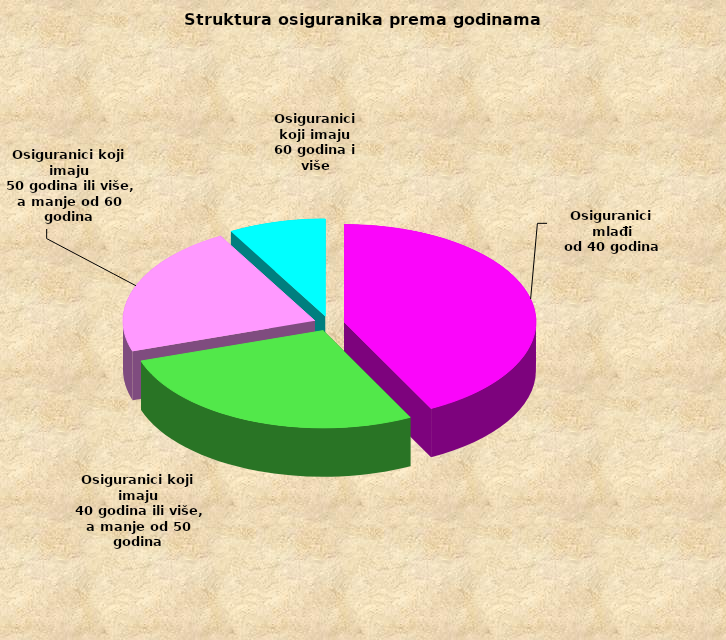
| Category | Series 0 |
|---|---|
| Osiguranici mlađi
od 40 godina | 708013 |
| Osiguranici koji imaju
 40 godina ili više, a manje od 50 godina | 456907 |
| Osiguranici koji imaju
 50 godina ili više, a manje od 60 godina | 364610 |
| Osiguranici koji imaju
60 godina i više | 136187 |